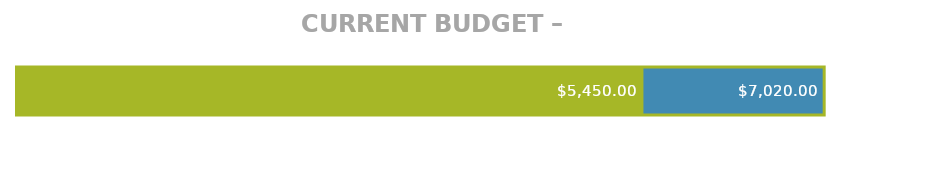
| Category | Total Income | Total Expenses |
|---|---|---|
| 0 | 7020 | 5450 |